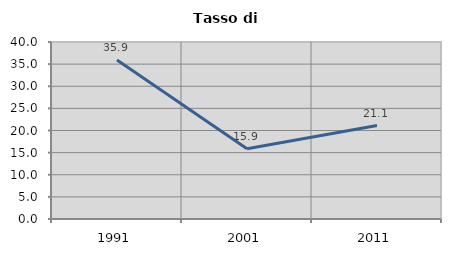
| Category | Tasso di disoccupazione   |
|---|---|
| 1991.0 | 35.926 |
| 2001.0 | 15.869 |
| 2011.0 | 21.108 |